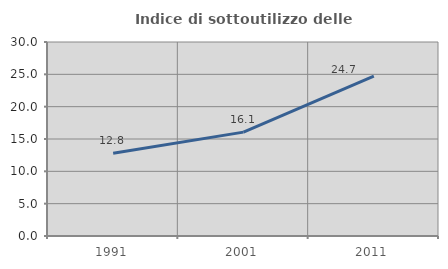
| Category | Indice di sottoutilizzo delle abitazioni  |
|---|---|
| 1991.0 | 12.808 |
| 2001.0 | 16.062 |
| 2011.0 | 24.713 |